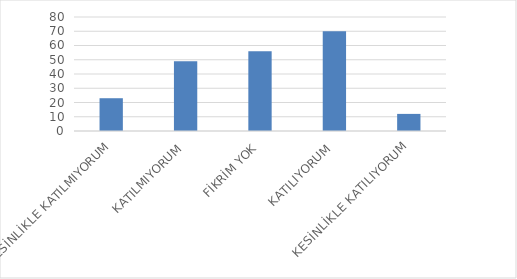
| Category | Series 0 |
|---|---|
| KESİNLİKLE KATILMIYORUM | 23 |
| KATILMIYORUM | 49 |
| FİKRİM YOK | 56 |
| KATILIYORUM | 70 |
| KESİNLİKLE KATILIYORUM | 12 |